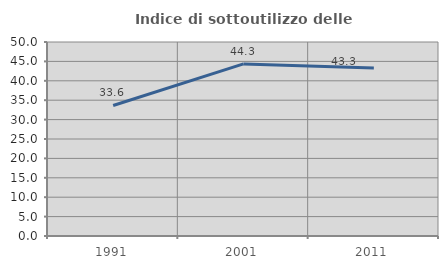
| Category | Indice di sottoutilizzo delle abitazioni  |
|---|---|
| 1991.0 | 33.645 |
| 2001.0 | 44.348 |
| 2011.0 | 43.284 |